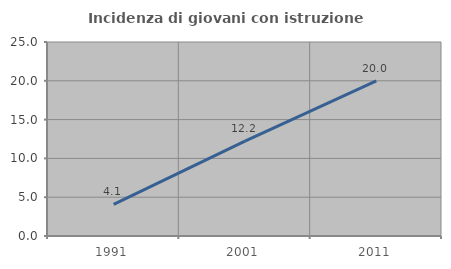
| Category | Incidenza di giovani con istruzione universitaria |
|---|---|
| 1991.0 | 4.065 |
| 2001.0 | 12.234 |
| 2011.0 | 20 |